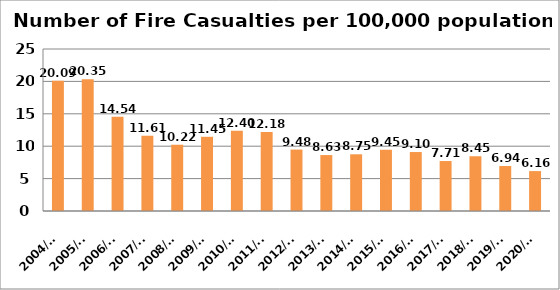
| Category | Series 0 |
|---|---|
| 2004/05 | 20.09 |
| 2005/06 | 20.35 |
| 2006/07 | 14.54 |
| 2007/08 | 11.61 |
| 2008/09 | 10.22 |
| 2009/10 | 11.45 |
| 2010/11 | 12.4 |
| 2011/12 | 12.18 |
| 2012/13 | 9.48 |
| 2013/14 | 8.63 |
| 2014/15 | 8.75 |
| 2015/16 | 9.45 |
| 2016/17 | 9.1 |
| 2017/18 | 7.71 |
| 2018/19 | 8.45 |
| 2019/20 | 6.94 |
| 2020/21 | 6.16 |